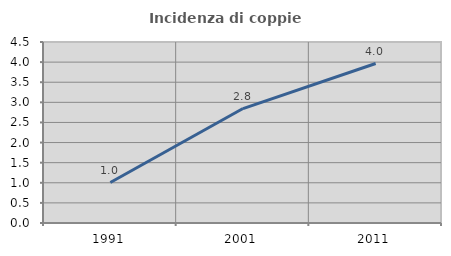
| Category | Incidenza di coppie miste |
|---|---|
| 1991.0 | 1.007 |
| 2001.0 | 2.846 |
| 2011.0 | 3.965 |